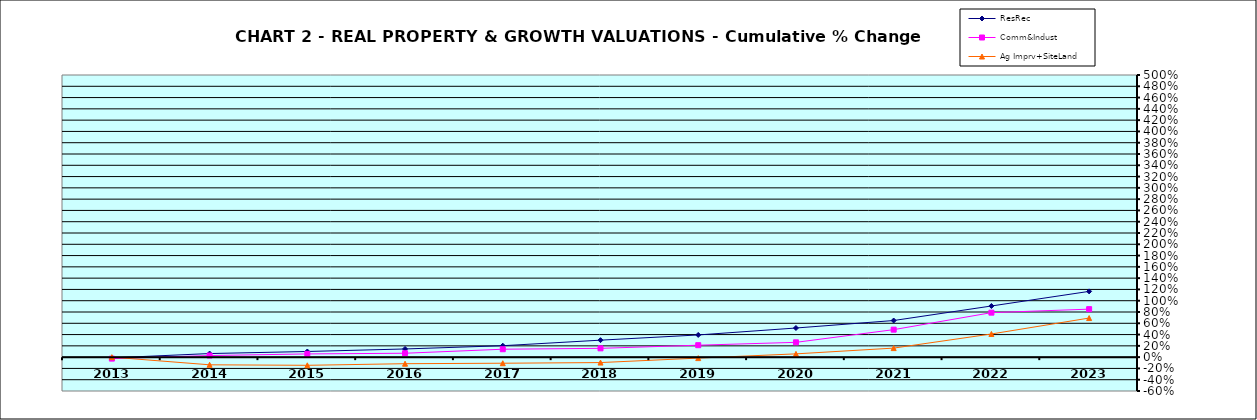
| Category | ResRec | Comm&Indust | Ag Imprv+SiteLand |
|---|---|---|---|
| 2013.0 | -0.013 | -0.026 | 0 |
| 2014.0 | 0.064 | 0.028 | -0.136 |
| 2015.0 | 0.1 | 0.057 | -0.145 |
| 2016.0 | 0.145 | 0.069 | -0.116 |
| 2017.0 | 0.202 | 0.14 | -0.108 |
| 2018.0 | 0.301 | 0.156 | -0.096 |
| 2019.0 | 0.393 | 0.212 | -0.017 |
| 2020.0 | 0.516 | 0.262 | 0.058 |
| 2021.0 | 0.649 | 0.487 | 0.16 |
| 2022.0 | 0.906 | 0.788 | 0.411 |
| 2023.0 | 1.165 | 0.851 | 0.693 |